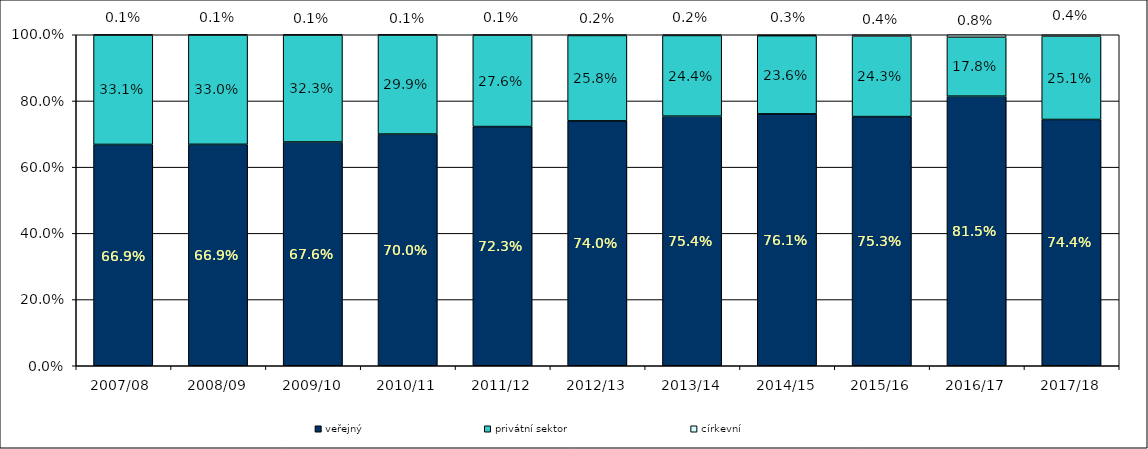
| Category | veřejný | privátní sektor | církevní |
|---|---|---|---|
| 2007/08  | 0.669 | 0.331 | 0.001 |
| 2008/09 | 0.669 | 0.33 | 0.001 |
| 2009/10 | 0.676 | 0.323 | 0.001 |
| 2010/11 | 0.7 | 0.299 | 0.001 |
| 2011/12 | 0.723 | 0.276 | 0.001 |
| 2012/13 | 0.74 | 0.258 | 0.002 |
| 2013/14 | 0.754 | 0.244 | 0.002 |
| 2014/15 | 0.761 | 0.236 | 0.003 |
| 2015/16 | 0.753 | 0.243 | 0.004 |
| 2016/17 | 0.815 | 0.178 | 0.008 |
| 2017/18 | 0.744 | 0.251 | 0.004 |